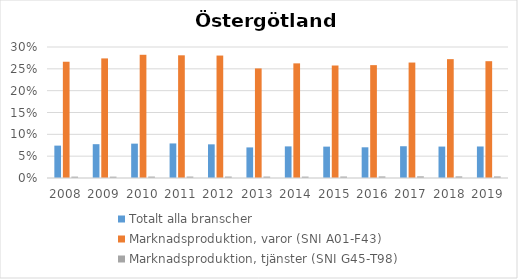
| Category | Totalt alla branscher | Marknadsproduktion, varor (SNI A01-F43) | Marknadsproduktion, tjänster (SNI G45-T98) |
|---|---|---|---|
| 2008 | 0.074 | 0.266 | 0.003 |
| 2009 | 0.077 | 0.274 | 0.003 |
| 2010 | 0.079 | 0.282 | 0.003 |
| 2011 | 0.079 | 0.281 | 0.003 |
| 2012 | 0.077 | 0.28 | 0.003 |
| 2013 | 0.07 | 0.251 | 0.003 |
| 2014 | 0.072 | 0.263 | 0.003 |
| 2015 | 0.072 | 0.258 | 0.003 |
| 2016 | 0.07 | 0.258 | 0.004 |
| 2017 | 0.073 | 0.264 | 0.004 |
| 2018 | 0.072 | 0.272 | 0.004 |
| 2019 | 0.072 | 0.267 | 0.004 |